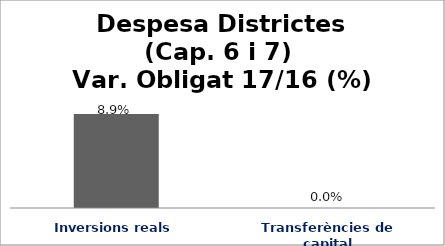
| Category | Series 0 |
|---|---|
| Inversions reals | 0.089 |
| Transferències de capital | 0 |